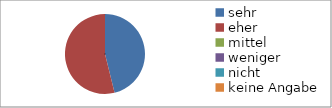
| Category | Series 0 |
|---|---|
| sehr | 6 |
| eher | 7 |
| mittel | 0 |
| weniger | 0 |
| nicht  | 0 |
| keine Angabe | 0 |